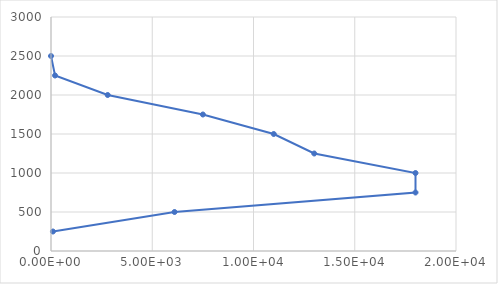
| Category | Height |
|---|---|
| 96.0 | 250 |
| 6100.0 | 500 |
| 18000.0 | 750 |
| 18000.0 | 1000 |
| 13000.0 | 1250 |
| 11000.0 | 1500 |
| 7500.0 | 1750 |
| 2800.0 | 2000 |
| 200.0 | 2250 |
| 0.29 | 2500 |